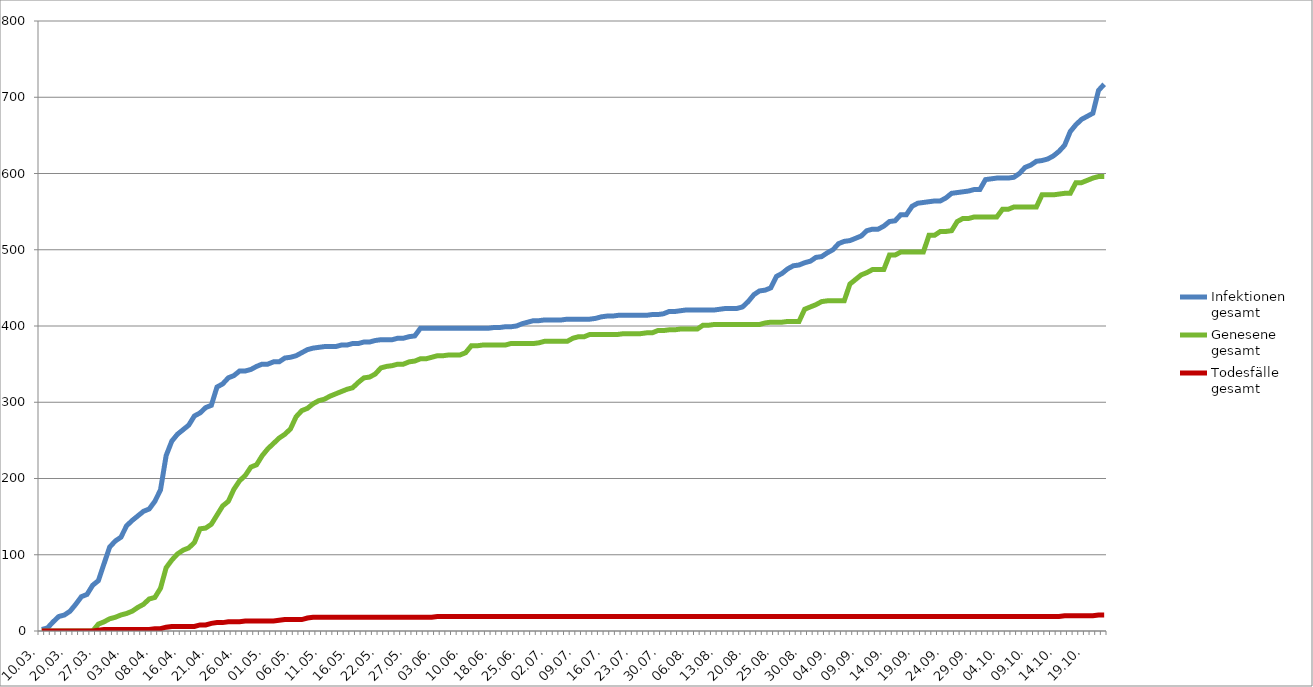
| Category | Infektionen
gesamt | Genesene
gesamt | Todesfälle
gesamt |
|---|---|---|---|
| 10.03. | 2 | 0 | 0 |
| 13.03. | 4 | 0 | 0 |
| 16.03. | 12 | 0 | 0 |
| 18.03. | 19 | 0 | 0 |
| 19.03. | 21 | 0 | 0 |
| 20.03. | 26 | 0 | 0 |
| 23.03. | 35 | 0 | 0 |
| 24.03. | 45 | 0 | 0 |
| 25.03. | 48 | 0 | 0 |
| 26.03. | 60 | 0 | 0 |
| 27.03. | 66 | 9 | 1 |
| 30.03. | 88 | 12 | 2 |
| 31.03. | 110 | 16 | 2 |
| 01.04. | 118 | 18 | 2 |
| 02.04. | 123 | 21 | 2 |
| 03.04. | 138 | 23 | 2 |
| 04.04. | 145 | 26 | 2 |
| 05.04. | 151 | 31 | 2 |
| 06.04. | 157 | 35 | 2 |
| 07.04. | 160 | 42 | 2 |
| 08.04. | 170 | 44 | 3 |
| 09.04. | 185 | 56 | 3 |
| 13.04. | 230 | 83 | 5 |
| 14.04. | 249 | 93 | 6 |
| 15.04. | 258 | 101 | 6 |
| 16.04. | 264 | 106 | 6 |
| 17.04. | 270 | 109 | 6 |
| 18.04. | 282 | 116 | 6 |
| 19.04. | 286 | 134 | 8 |
| 20.04. | 293 | 135 | 8 |
| 21.04. | 296 | 140 | 10 |
| 22.04. | 320 | 152 | 11 |
| 23.04. | 324 | 164 | 11 |
| 24.04. | 332 | 170 | 12 |
| 25.04. | 335 | 186 | 12 |
| 26.04. | 341 | 197 | 12 |
| 27.04. | 341 | 204 | 13 |
| 28.04. | 343 | 215 | 13 |
| 29.04. | 347 | 218 | 13 |
| 30.04. | 350 | 230 | 13 |
| 01.05. | 350 | 239 | 13 |
| 02.05. | 353 | 246 | 13 |
| 03.05. | 353 | 253 | 14 |
| 04.05. | 358 | 258 | 15 |
| 05.05. | 359 | 265 | 15 |
| 06.05. | 361 | 281 | 15 |
| 07.05. | 365 | 289 | 15 |
| 08.05. | 369 | 292 | 17 |
| 09.05. | 371 | 298 | 18 |
| 10.05. | 372 | 302 | 18 |
| 11.05. | 373 | 304 | 18 |
| 12.05. | 373 | 308 | 18 |
| 13.05. | 373 | 311 | 18 |
| 14.05. | 375 | 314 | 18 |
| 15.05. | 375 | 317 | 18 |
| 16.05. | 377 | 319 | 18 |
| 17.05. | 377 | 326 | 18 |
| 18.05. | 379 | 332 | 18 |
| 19.05. | 379 | 333 | 18 |
| 20.05. | 381 | 337 | 18 |
| 22.05. | 382 | 345 | 18 |
| 23.05. | 382 | 347 | 18 |
| 24.05. | 382 | 348 | 18 |
| 25.05. | 384 | 350 | 18 |
| 26.05. | 384 | 350 | 18 |
| 27.05. | 386 | 353 | 18 |
| 28.05. | 387 | 354 | 18 |
| 29.05. | 397 | 357 | 18 |
| 30.05. | 397 | 357 | 18 |
| 02.06. | 397 | 359 | 18 |
| 03.06. | 397 | 361 | 19 |
| 04.06. | 397 | 361 | 19 |
| 05.06. | 397 | 362 | 19 |
| 08.06. | 397 | 362 | 19 |
| 09.06. | 397 | 362 | 19 |
| 10.06. | 397 | 365 | 19 |
| 12.06. | 397 | 374 | 19 |
| 15.06. | 397 | 374 | 19 |
| 16.06. | 397 | 375 | 19 |
| 17.06. | 397 | 375 | 19 |
| 18.06. | 398 | 375 | 19 |
| 19.06. | 398 | 375 | 19 |
| 22.06. | 399 | 375 | 19 |
| 23.06. | 399 | 377 | 19 |
| 24.06. | 400 | 377 | 19 |
| 25.06. | 403 | 377 | 19 |
| 26.06. | 405 | 377 | 19 |
| 29.06. | 407 | 377 | 19 |
| 30.06. | 407 | 378 | 19 |
| 01.07. | 408 | 380 | 19 |
| 02.07. | 408 | 380 | 19 |
| 03.07. | 408 | 380 | 19 |
| 06.07. | 408 | 380 | 19 |
| 07.07. | 409 | 380 | 19 |
| 08.07. | 409 | 384 | 19 |
| 09.07. | 409 | 386 | 19 |
| 10.07. | 409 | 386 | 19 |
| 13.07. | 409 | 389 | 19 |
| 14.07. | 410 | 389 | 19 |
| 15.07. | 412 | 389 | 19 |
| 16.07. | 413 | 389 | 19 |
| 17.07. | 413 | 389 | 19 |
| 20.07. | 414 | 389 | 19 |
| 21.07. | 414 | 390 | 19 |
| 22.07. | 414 | 390 | 19 |
| 23.07. | 414 | 390 | 19 |
| 24.07. | 414 | 390 | 19 |
| 27.07. | 414 | 391 | 19 |
| 28.07. | 415 | 391 | 19 |
| 29.07. | 415 | 394 | 19 |
| 30.07. | 416 | 394 | 19 |
| 31.07. | 419 | 395 | 19 |
| 03.08. | 419 | 395 | 19 |
| 04.08. | 420 | 396 | 19 |
| 05.08. | 421 | 396 | 19 |
| 06.08. | 421 | 396 | 19 |
| 07.08. | 421 | 396 | 19 |
| 10.08. | 421 | 401 | 19 |
| 11.08. | 421 | 401 | 19 |
| 12.08. | 421 | 402 | 19 |
| 13.08. | 422 | 402 | 19 |
| 14.08. | 423 | 402 | 19 |
| 17.08. | 423 | 402 | 19 |
| 18.08. | 423 | 402 | 19 |
| 19.08. | 425 | 402 | 19 |
| 20.08. | 432 | 402 | 19 |
| 21.08. | 441 | 402 | 19 |
| 22.08. | 446 | 402 | 19 |
| 23.08. | 447 | 404 | 19 |
| 24.08. | 450 | 405 | 19 |
| 25.08. | 465 | 405 | 19 |
| 26.08. | 469 | 405 | 19 |
| 27.08. | 475 | 406 | 19 |
| 28.08. | 479 | 406 | 19 |
| 29.08. | 480 | 406 | 19 |
| 30.08. | 483 | 422 | 19 |
| 31.08. | 485 | 425 | 19 |
| 01.09. | 490 | 428 | 19 |
| 02.09. | 491 | 432 | 19 |
| 03.09. | 496 | 433 | 19 |
| 04.09. | 500 | 433 | 19 |
| 05.09. | 508 | 433 | 19 |
| 06.09. | 511 | 433 | 19 |
| 07.09. | 512 | 455 | 19 |
| 08.09. | 515 | 461 | 19 |
| 09.09. | 518 | 467 | 19 |
| 10.09. | 525 | 470 | 19 |
| 11.09. | 527 | 474 | 19 |
| 12.09. | 527 | 474 | 19 |
| 13.09. | 531 | 474 | 19 |
| 14.09. | 537 | 493 | 19 |
| 15.09. | 538 | 493 | 19 |
| 16.09. | 546 | 497 | 19 |
| 17.09. | 546 | 497 | 19 |
| 18.09. | 557 | 497 | 19 |
| 19.09. | 561 | 497 | 19 |
| 20.09. | 562 | 497 | 19 |
| 21.09. | 563 | 519 | 19 |
| 22.09. | 564 | 519 | 19 |
| 23.o9. | 564 | 524 | 19 |
| 24.09. | 568 | 524 | 19 |
| 25.09. | 574 | 525 | 19 |
| 26.09. | 575 | 537 | 19 |
| 27.09. | 576 | 541 | 19 |
| 28.09. | 577 | 541 | 19 |
| 29.09. | 579 | 543 | 19 |
| 30.09. | 579 | 543 | 19 |
| 01.10. | 592 | 543 | 19 |
| 02.10. | 593 | 543 | 19 |
| 03.10. | 594 | 543 | 19 |
| 04.10. | 594 | 553 | 19 |
| 05.10. | 594 | 553 | 19 |
| 06.10. | 595 | 556 | 19 |
| 07.10. | 600 | 556 | 19 |
| 08.10. | 608 | 556 | 19 |
| 09.10. | 611 | 556 | 19 |
| 10.10. | 616 | 556 | 19 |
| 11.10. | 617 | 572 | 19 |
| 12.10. | 619 | 572 | 19 |
| 13.10. | 623 | 572 | 19 |
| 14.10. | 629 | 573 | 19 |
| 15.10. | 637 | 574 | 20 |
| 16.10. | 655 | 574 | 20 |
| 17.10. | 664 | 588 | 20 |
| 18.10. | 671 | 588 | 20 |
| 19.10. | 675 | 591 | 20 |
| 20.10. | 679 | 594 | 20 |
| 21.10. | 709 | 596 | 21 |
| 22.10. | 717 | 596 | 21 |